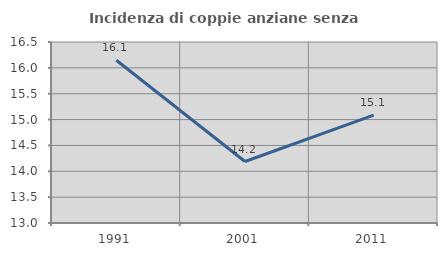
| Category | Incidenza di coppie anziane senza figli  |
|---|---|
| 1991.0 | 16.148 |
| 2001.0 | 14.189 |
| 2011.0 | 15.085 |